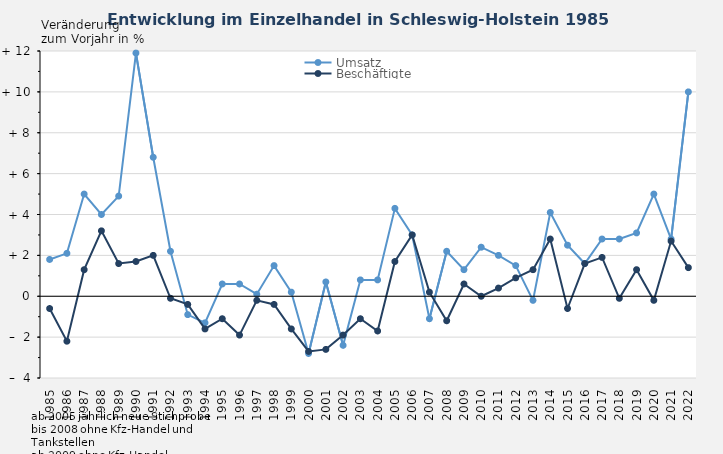
| Category | Umsatz | Beschäftigte |
|---|---|---|
| 1985.0 | 1.8 | -0.6 |
| 1986.0 | 2.1 | -2.2 |
| 1987.0 | 5 | 1.3 |
| 1988.0 | 4 | 3.2 |
| 1989.0 | 4.9 | 1.6 |
| 1990.0 | 11.9 | 1.7 |
| 1991.0 | 6.8 | 2 |
| 1992.0 | 2.2 | -0.1 |
| 1993.0 | -0.9 | -0.4 |
| 1994.0 | -1.3 | -1.6 |
| 1995.0 | 0.6 | -1.1 |
| 1996.0 | 0.6 | -1.9 |
| 1997.0 | 0.1 | -0.2 |
| 1998.0 | 1.5 | -0.4 |
| 1999.0 | 0.2 | -1.6 |
| 2000.0 | -2.8 | -2.7 |
| 2001.0 | 0.7 | -2.6 |
| 2002.0 | -2.4 | -1.9 |
| 2003.0 | 0.8 | -1.1 |
| 2004.0 | 0.8 | -1.7 |
| 2005.0 | 4.3 | 1.7 |
| 2006.0 | 3 | 3 |
| 2007.0 | -1.1 | 0.2 |
| 2008.0 | 2.2 | -1.2 |
| 2009.0 | 1.3 | 0.6 |
| 2010.0 | 2.4 | 0 |
| 2011.0 | 2 | 0.4 |
| 2012.0 | 1.5 | 0.9 |
| 2013.0 | -0.2 | 1.3 |
| 2014.0 | 4.1 | 2.8 |
| 2015.0 | 2.5 | -0.6 |
| 2016.0 | 1.6 | 1.6 |
| 2017.0 | 2.8 | 1.9 |
| 2018.0 | 2.8 | -0.1 |
| 2019.0 | 3.1 | 1.3 |
| 2020.0 | 5 | -0.2 |
| 2021.0 | 2.8 | 2.7 |
| 2022.0 | 10 | 1.4 |